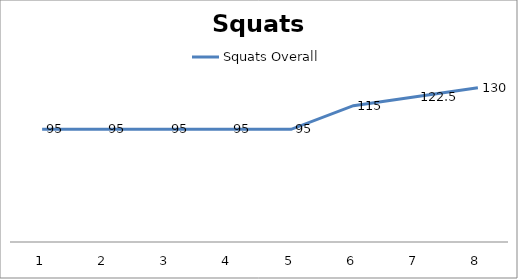
| Category | Squats Overall |
|---|---|
| 0 | 95 |
| 1 | 95 |
| 2 | 95 |
| 3 | 95 |
| 4 | 95 |
| 5 | 115 |
| 6 | 122.5 |
| 7 | 130 |